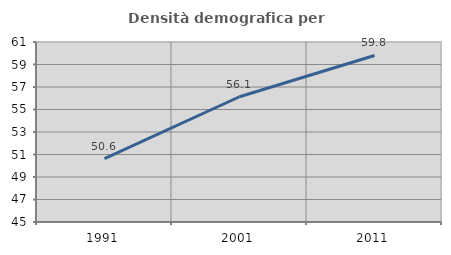
| Category | Densità demografica |
|---|---|
| 1991.0 | 50.629 |
| 2001.0 | 56.132 |
| 2011.0 | 59.801 |